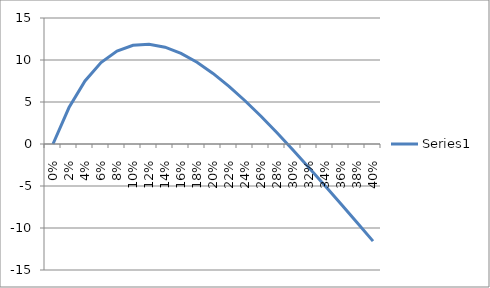
| Category | Series 0 |
|---|---|
| 0.0 | 0 |
| 0.02 | 4.34 |
| 0.04 | 7.508 |
| 0.06 | 9.696 |
| 0.08 | 11.067 |
| 0.1 | 11.756 |
| 0.12 | 11.878 |
| 0.14 | 11.529 |
| 0.16 | 10.79 |
| 0.18 | 9.729 |
| 0.2 | 8.404 |
| 0.22 | 6.864 |
| 0.24 | 5.151 |
| 0.26 | 3.299 |
| 0.28 | 1.337 |
| 0.3 | -0.708 |
| 0.32 | -2.817 |
| 0.34 | -4.97 |
| 0.36 | -7.153 |
| 0.38 | -9.354 |
| 0.4 | -11.561 |